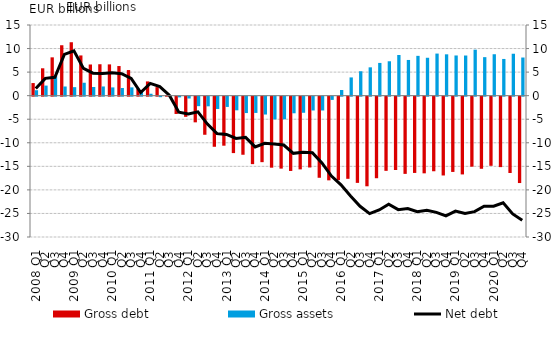
| Category | Gross debt | Gross assets |
|---|---|---|
| 2008 Q1 | 2.678 | 1.155 |
| Q2 | 5.81 | 2.14 |
| Q3 | 8.134 | 4.229 |
| Q4 | 10.703 | 1.946 |
| 2009 Q1 | 11.342 | 1.807 |
| Q2 | 8.54 | 2.745 |
| Q3 | 6.618 | 1.846 |
| Q4 | 6.671 | 1.952 |
| 2010 Q1 | 6.639 | 1.755 |
| Q2 | 6.289 | 1.626 |
| Q3 | 5.439 | 1.76 |
| Q4 | 1.492 | 0.816 |
| 2011 Q1 | 3.024 | 0.408 |
| Q2 | 1.819 | -0.11 |
| Q3 | 0.155 | 0.068 |
| Q4 | -3.672 | -0.147 |
| 2012 Q1 | -4.278 | -0.388 |
| Q2 | -5.449 | -2.015 |
| Q3 | -8.086 | -2.048 |
| Q4 | -10.636 | -2.611 |
| 2013 Q1 | -10.407 | -2.179 |
| Q2 | -11.977 | -2.897 |
| Q3 | -12.329 | -3.478 |
| Q4 | -14.322 | -3.451 |
| 2014 Q1 | -13.901 | -3.791 |
| Q2 | -15.074 | -4.821 |
| Q3 | -15.274 | -4.798 |
| Q4 | -15.768 | -3.527 |
| 2015 Q1 | -15.435 | -3.419 |
| Q2 | -15.035 | -2.932 |
| Q3 | -17.217 | -2.932 |
| Q4 | -17.762 | -0.688 |
| 2016 Q1 | -17.718 | 1.198 |
| Q2 | -17.437 | 3.873 |
| Q3 | -18.299 | 5.184 |
| Q4 | -19.022 | 6.013 |
| 2017 Q1 | -17.312 | 6.95 |
| Q2 | -15.746 | 7.302 |
| Q3 | -15.563 | 8.633 |
| Q4 | -16.389 | 7.58 |
| 2018 Q1 | -16.188 | 8.451 |
| Q2 | -16.273 | 8.045 |
| Q3 | -15.833 | 8.935 |
| Q4 | -16.729 | 8.776 |
| 2019 Q1 | -15.976 | 8.531 |
| Q2 | -16.505 | 8.522 |
| Q3 | -14.862 | 9.762 |
| Q4 | -15.307 | 8.175 |
| 2020 Q1 | -14.677 | 8.794 |
| Q2 | -14.956 | 7.793 |
| Q3 | -16.208 | 8.9 |
| Q4 | -18.335 | 8.097 |